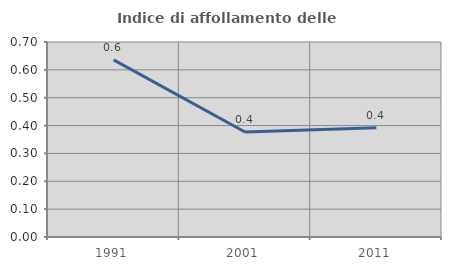
| Category | Indice di affollamento delle abitazioni  |
|---|---|
| 1991.0 | 0.636 |
| 2001.0 | 0.377 |
| 2011.0 | 0.392 |